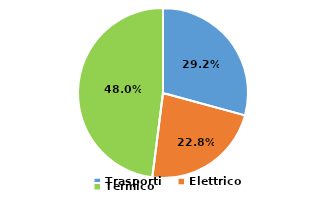
| Category | Series 0 |
|---|---|
| Trasporti | 29.243 |
| Elettrico | 22.762 |
| Termico | 47.994 |